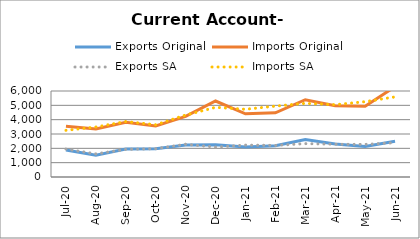
| Category | Exports Original | Imports Original | Exports SA | Imports SA |
|---|---|---|---|---|
| 2020-07-11 | 1887 | 3534 | 1949 | 3257 |
| 2020-08-11 | 1515 | 3343 | 1612 | 3488 |
| 2020-09-11 | 1947 | 3821 | 1927 | 3867 |
| 2020-10-11 | 1969 | 3557 | 1974 | 3646 |
| 2020-11-11 | 2240 | 4225 | 2284 | 4322 |
| 2020-12-11 | 2255 | 5302 | 2086 | 4860 |
| 2021-01-11 | 2100 | 4412 | 2228 | 4725 |
| 2021-02-11 | 2184 | 4476 | 2204 | 4946 |
| 2021-03-11 | 2616 | 5392 | 2328 | 5139 |
| 2021-04-11 | 2304 | 4975 | 2286 | 5045 |
| 2021-05-11 | 2130 | 4934 | 2274 | 5255 |
| 2021-06-11 | 2492 | 6302 | 2392 | 5589 |